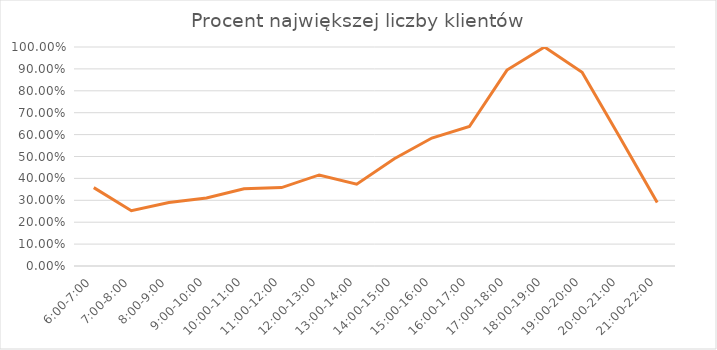
| Category | % najw liczby |
|---|---|
| 6:00-7:00 | 0.358 |
| 7:00-8:00 | 0.253 |
| 8:00-9:00 | 0.289 |
| 9:00-10:00 | 0.311 |
| 10:00-11:00 | 0.353 |
| 11:00-12:00 | 0.358 |
| 12:00-13:00 | 0.416 |
| 13:00-14:00 | 0.374 |
| 14:00-15:00 | 0.489 |
| 15:00-16:00 | 0.584 |
| 16:00-17:00 | 0.637 |
| 17:00-18:00 | 0.895 |
| 18:00-19:00 | 1 |
| 19:00-20:00 | 0.884 |
| 20:00-21:00 | 0.589 |
| 21:00-22:00 | 0.289 |